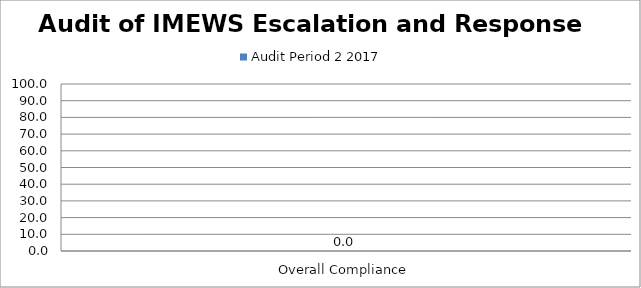
| Category | Audit Period 2 2017 |
|---|---|
| Overall Compliance | 0 |